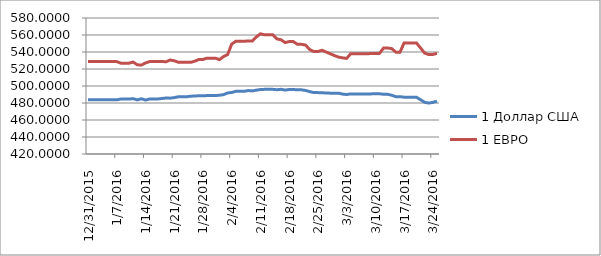
| Category | 1 Доллар США | 1 ЕВРО |
|---|---|---|
| 12/31/15 | 483.75 | 528.69 |
| 1/1/16 | 483.75 | 528.69 |
| 1/2/16 | 483.75 | 528.69 |
| 1/3/16 | 483.75 | 528.69 |
| 1/4/16 | 483.75 | 528.69 |
| 1/5/16 | 483.75 | 528.69 |
| 1/6/16 | 483.75 | 528.69 |
| 1/7/16 | 483.75 | 528.69 |
| 1/8/16 | 484.68 | 526.85 |
| 1/9/16 | 484.68 | 526.85 |
| 1/10/16 | 484.68 | 526.85 |
| 1/11/16 | 485.1 | 528.13 |
| 1/12/16 | 483.67 | 524.93 |
| 1/13/16 | 485.01 | 524.64 |
| 1/14/16 | 483.45 | 527.11 |
| 1/15/16 | 484.74 | 528.71 |
| 1/16/16 | 484.74 | 528.71 |
| 1/17/16 | 484.74 | 528.71 |
| 1/18/16 | 485.3 | 528.93 |
| 1/19/16 | 485.87 | 528.43 |
| 1/20/16 | 485.69 | 530.62 |
| 1/21/16 | 486.35 | 529.68 |
| 1/22/16 | 487.33 | 527.97 |
| 1/23/16 | 487.33 | 527.97 |
| 1/24/16 | 487.33 | 527.97 |
| 1/25/16 | 487.99 | 527.81 |
| 1/26/16 | 488.23 | 529.19 |
| 1/27/16 | 488.48 | 531.17 |
| 1/28/16 | 488.48 | 531.17 |
| 1/29/16 | 488.75 | 532.79 |
| 1/30/16 | 488.75 | 532.79 |
| 1/31/16 | 488.75 | 532.79 |
| 2/1/16 | 489.16 | 531.03 |
| 2/2/16 | 489.82 | 534.59 |
| 2/3/16 | 491.78 | 536.97 |
| 2/4/16 | 492.41 | 549.33 |
| 2/5/16 | 493.7 | 552.7 |
| 2/6/16 | 493.7 | 552.7 |
| 2/7/16 | 493.7 | 552.7 |
| 2/8/16 | 494.63 | 552.9 |
| 2/9/16 | 494.24 | 553.01 |
| 2/10/16 | 495.09 | 557.72 |
| 2/11/16 | 495.86 | 561.41 |
| 2/12/16 | 496.05 | 560.29 |
| 2/13/16 | 496.05 | 560.29 |
| 2/14/16 | 496.05 | 560.29 |
| 2/15/16 | 495.61 | 555.38 |
| 2/16/16 | 496.11 | 554.4 |
| 2/17/16 | 495.19 | 551.1 |
| 2/18/16 | 495.88 | 552.26 |
| 2/19/16 | 495.88 | 552.26 |
| 2/20/16 | 495.53 | 549.05 |
| 2/21/16 | 495.53 | 549.05 |
| 2/22/16 | 494.74 | 548.17 |
| 2/23/16 | 493.38 | 542.87 |
| 2/24/16 | 492.22 | 540.56 |
| 2/25/16 | 492.22 | 540.56 |
| 2/26/16 | 492.04 | 542.03 |
| 2/29/16 | 491.34 | 535.86 |
| 3/1/16 | 491.6 | 534.03 |
| 3/2/16 | 490.48 | 533.1 |
| 3/3/16 | 490 | 532.48 |
| 3/4/16 | 490.7 | 538 |
| 3/5/16 | 490.7 | 538 |
| 3/6/16 | 490.7 | 538 |
| 3/7/16 | 490.7 | 538 |
| 3/8/16 | 490.7 | 538 |
| 3/9/16 | 490.73 | 538.18 |
| 3/10/16 | 490.9 | 538.37 |
| 3/11/16 | 490.9 | 538.37 |
| 3/12/16 | 490.23 | 544.74 |
| 3/13/16 | 490.23 | 544.74 |
| 3/14/16 | 489.11 | 543.94 |
| 3/15/16 | 487.41 | 539.81 |
| 3/16/16 | 487.41 | 539.81 |
| 3/17/16 | 486.85 | 550.68 |
| 3/18/16 | 486.85 | 550.68 |
| 3/19/16 | 486.85 | 550.68 |
| 3/20/16 | 486.85 | 550.68 |
| 3/21/16 | 483.86 | 544.78 |
| 3/22/16 | 480.84 | 538.73 |
| 3/23/16 | 479.93 | 536.99 |
| 3/24/16 | 480.73 | 537.12 |
| 3/25/16 | 482.16 | 538.43 |